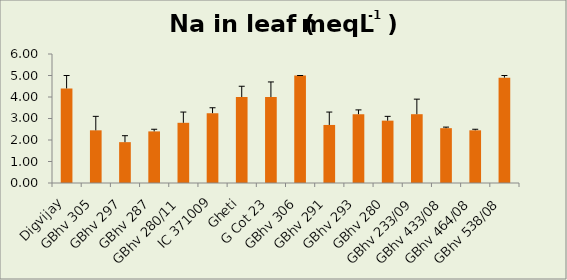
| Category | Na in leaf (meqL-1 ) |
|---|---|
| Digvijay | 4.4 |
| GBhv 305 | 2.45 |
| GBhv 297 | 1.9 |
| GBhv 287 | 2.4 |
| GBhv 280/11 | 2.8 |
| IC 371009 | 3.25 |
| Gheti | 4 |
| G Cot 23 | 4 |
| GBhv 306 | 5 |
| GBhv 291 | 2.7 |
| GBhv 293 | 3.2 |
| GBhv 280 | 2.9 |
| GBhv 233/09 | 3.2 |
| GBhv 433/08 | 2.55 |
| GBhv 464/08 | 2.45 |
| GBhv 538/08 | 4.9 |